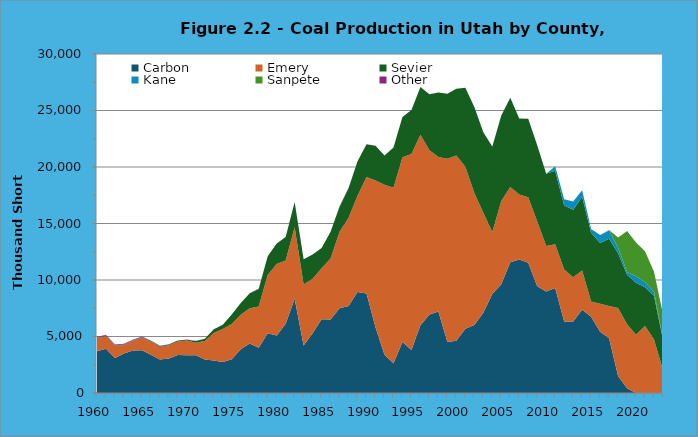
| Category | Carbon | Emery | Sevier | Kane | Sanpete | Other |
|---|---|---|---|---|---|---|
| 1960 | 3698 | 1137 | 49 | 0 | 0 | 71 |
| 1961 | 3916 | 1124 | 47 | 0 | 0 | 72 |
| 1962 | 3105 | 1077 | 49 | 0 | 0 | 66 |
| 1963 | 3493 | 752 | 47 | 1 | 0 | 66 |
| 1964 | 3752 | 848 | 47 | 2 | 0 | 71 |
| 1965 | 3779 | 1101 | 61 | 2 | 0 | 49 |
| 1966 | 3380 | 1170 | 65 | 2 | 0 | 19 |
| 1967 | 2971 | 1113 | 72 | 2 | 0 | 16 |
| 1968 | 3062 | 1167 | 70 | 2 | 0 | 16 |
| 1969 | 3367 | 1200 | 72 | 2 | 0 | 16 |
| 1970 | 3349 | 1292 | 79 | 0 | 0 | 13 |
| 1971 | 3347 | 1097 | 158 | 12 | 0 | 12 |
| 1972 | 2956 | 1656 | 184 | 0 | 0 | 6 |
| 1973 | 2866 | 2445 | 339 | 0 | 0 | 0 |
| 1974 | 2754 | 2901 | 391 | 0 | 0 | 0 |
| 1975 | 2984 | 3126 | 827 | 0 | 0 | 0 |
| 1976 | 3868 | 3057 | 1043 | 0 | 0 | 0 |
| 1977 | 4390 | 3107 | 1337 | 0 | 0 | 4 |
| 1978 | 4005 | 3640 | 1558 | 0 | 0 | 50 |
| 1979 | 5292 | 5147 | 1657 | 0 | 0 | 0 |
| 1980 | 5096 | 6319 | 1821 | 0 | 0 | 0 |
| 1981 | 6123 | 5609 | 2076 | 0 | 0 | 0 |
| 1982 | 8335 | 6329 | 2248 | 0 | 0 | 0 |
| 1983 | 4194 | 5404 | 2231 | 0 | 0 | 0 |
| 1984 | 5293 | 4825 | 2141 | 0 | 0 | 0 |
| 1985 | 6518 | 4516 | 1797 | 0 | 0 | 0 |
| 1986 | 6505 | 5404 | 2360 | 0 | 0 | 0 |
| 1987 | 7495 | 6765 | 2228 | 0 | 0 | 33 |
| 1988 | 7703 | 7801 | 2625 | 0 | 0 | 35 |
| 1989 | 8927 | 8531 | 3059 | 0 | 0 | 0 |
| 1990 | 8810 | 10315 | 2887 | 0 | 0 | 0 |
| 1991 | 5816 | 12980 | 3079 | 0 | 0 | 0 |
| 1992 | 3386 | 15049 | 2580 | 0 | 0 | 0 |
| 1993 | 2642 | 15528 | 3553 | 0 | 0 | 0 |
| 1994 | 4523 | 16330 | 3569 | 0 | 0 | 0 |
| 1995 | 3801 | 17344 | 3906 | 0 | 0 | 0 |
| 1996 | 5985.092 | 16871.908 | 4214 | 0 | 0 | 0 |
| 1997 | 6956 | 14533 | 4939 | 0 | 0 | 0 |
| 1998 | 7206 | 13675 | 5719 | 0 | 0 | 0 |
| 1999 | 4514 | 16214 | 5763 | 0 | 0 | 0 |
| 2000 | 4615 | 16399 | 5906 | 0 | 0 | 0 |
| 2001 | 5689 | 14334 | 7001 | 0 | 0 | 0 |
| 2002 | 6007 | 11692 | 7600 | 0 | 0 | 0 |
| 2003 | 7091 | 8852 | 7126 | 0 | 0 | 0 |
| 2004 | 8772 | 5477 | 7568 | 0 | 0 | 0 |
| 2005 | 9617.776 | 7371.855 | 7566.83 | 0 | 0 | 0 |
| 2006 | 11560.244 | 6662.412 | 7907.935 | 0 | 0 | 0 |
| 2007 | 11811.383 | 5764.719 | 6711.925 | 0 | 0 | 0 |
| 2008 | 11532.854 | 5796.462 | 6946.075 | 0 | 0 | 0 |
| 2009 | 9457.217 | 5721.569 | 6748.311 | 0 | 0 | 0 |
| 2010 | 8981.853 | 4025.809 | 6398.35 | 0 | 0 | 0 |
| 2011 | 9281.06 | 3891.071 | 6498.011 | 402.829 | 0 | 0 |
| 2012 | 6331.095 | 4602.726 | 5650.8 | 570.138 | 0 | 0 |
| 2013 | 6325.617 | 3921.165 | 5959.221 | 746.83 | 0 | 0 |
| 2014 | 7359.817 | 3478.932 | 6539.322 | 555.267 | 0 | 0 |
| 2015 | 6751.822 | 1339.514 | 6095.152 | 326.794 | 0 | 0 |
| 2016 | 5417.208 | 2480.908 | 5375.171 | 704.983 | 0 | 0 |
| 2017 | 4834.995 | 2867.47 | 5946.975 | 723.895 | 43.949 | 0 |
| 2018 | 1498.619 | 6018.58 | 4841.888 | 487.592 | 906.716 | 0 |
| 2019 | 430.488 | 5657.401 | 4373.95 | 240.01 | 3645.133 | 0 |
| 2020 | 0 | 5154.689 | 4600.554 | 569.092 | 3000.319 | 0 |
| 2021 | 0 | 5931.405 | 3425.329 | 434.295 | 2750.773 | 0 |
| 2022 | 0 | 4724.345 | 3881.633 | 354.264 | 1758.956 | 0 |
| 2023 | 0 | 2027.351 | 2692.304 | 66.659 | 2179.666 | 0 |